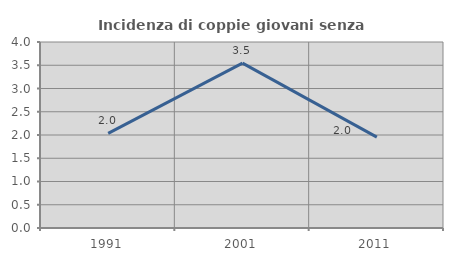
| Category | Incidenza di coppie giovani senza figli |
|---|---|
| 1991.0 | 2.036 |
| 2001.0 | 3.545 |
| 2011.0 | 1.953 |